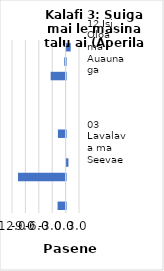
| Category | All items - m-m changes |
|---|---|
| 12 Isi Oloa ma Auaunaga | 0.914 |
| 02 Ava Malosi ma Tapaa | -0.302 |
| 01 Meaai ma Vaiinu | -3.344 |
| 11 Faleaiga | 0 |
| 10 Aoaoga | 0 |
| 08 Fesootaiga | 0 |
| 09 Faafiafiaga ma Aganuu | -1.725 |
| 03 Lavalava ma Seevae | 0 |
| 05 Meafale, Mea Faigaleuga mo Faaleleia o Aiga | 0.414 |
| 04 Fale, Suavai, Eletise, Kesi ma isi | -10.654 |
| 06 Soifua Maloloina | 0 |
| 07 Femalagaiga | -1.796 |